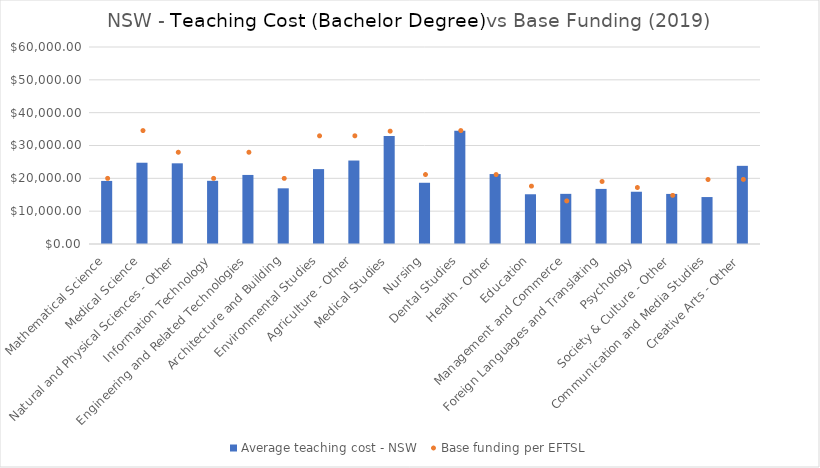
| Category | Average teaching cost - NSW  |
|---|---|
| Mathematical Science | 19210.715 |
| Medical Science | 24751.803 |
| Natural and Physical Sciences - Other | 24572.454 |
| Information Technology | 19245.501 |
| Engineering and Related Technologies | 21033.021 |
| Architecture and Building | 16958.277 |
| Environmental Studies | 22810.627 |
| Agriculture - Other | 25422.189 |
| Medical Studies | 32892.062 |
| Nursing | 18650.233 |
| Dental Studies | 34524.822 |
| Health - Other | 21305.071 |
| Education | 15149.864 |
| Management and Commerce | 15274.314 |
| Foreign Languages and Translating | 16777.63 |
| Psychology | 15917.039 |
| Society & Culture - Other | 15252.131 |
| Communication and Media Studies | 14299.017 |
| Creative Arts - Other | 23804.81 |